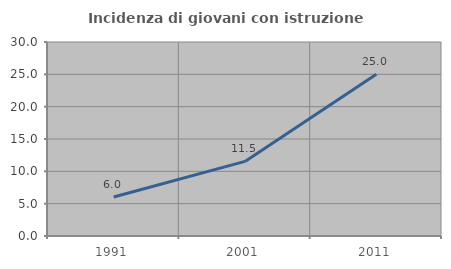
| Category | Incidenza di giovani con istruzione universitaria |
|---|---|
| 1991.0 | 6.038 |
| 2001.0 | 11.538 |
| 2011.0 | 25 |